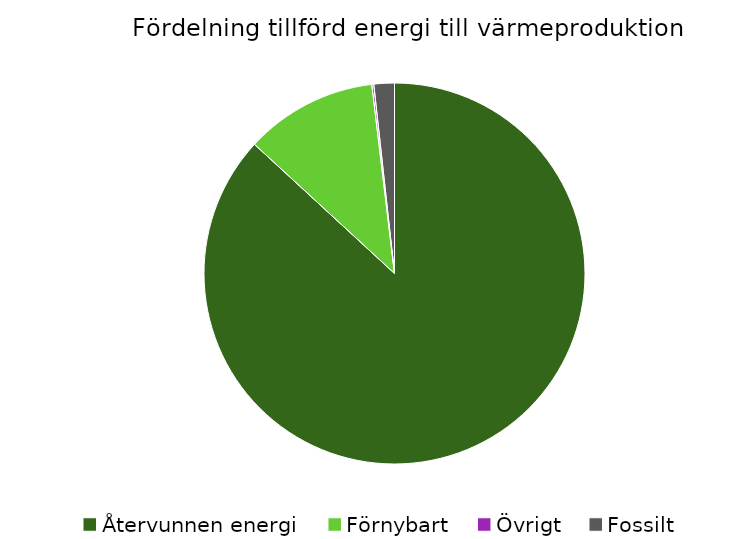
| Category | Fördelning värmeproduktion |
|---|---|
| Återvunnen energi | 0.869 |
| Förnybart | 0.112 |
| Övrigt | 0.002 |
| Fossilt | 0.017 |